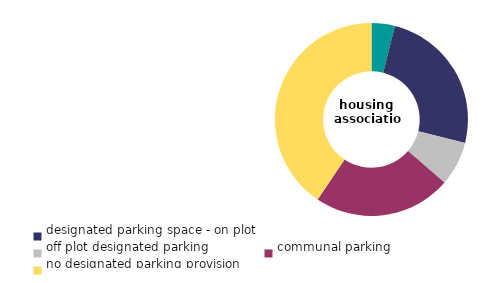
| Category | housing 
association |
|---|---|
| garage or car port - on plot | 3.9 |
| designated parking space - on plot | 25.027 |
| off plot designated parking | 7.42 |
| communal parking  | 23.076 |
| no designated parking provision | 40.577 |